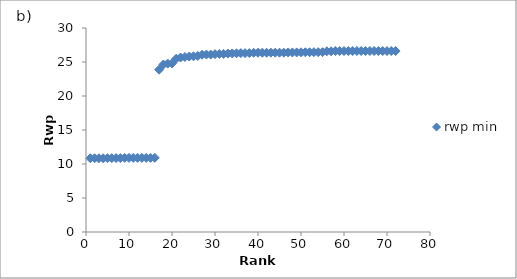
| Category | rwp min |
|---|---|
| 66.0 | 26.614 |
| 71.0 | 26.615 |
| 70.0 | 26.615 |
| 37.0 | 26.303 |
| 62.0 | 26.614 |
| 63.0 | 26.614 |
| 36.0 | 26.303 |
| 68.0 | 26.614 |
| 52.0 | 26.431 |
| 64.0 | 26.614 |
| 9.0 | 10.9 |
| 15.0 | 10.902 |
| 21.0 | 25.497 |
| 51.0 | 26.431 |
| 11.0 | 10.9 |
| 65.0 | 26.614 |
| 6.0 | 10.866 |
| 7.0 | 10.867 |
| 42.0 | 26.365 |
| 60.0 | 26.614 |
| 67.0 | 26.614 |
| 47.0 | 26.406 |
| 28.0 | 26.094 |
| 38.0 | 26.303 |
| 40.0 | 26.364 |
| 48.0 | 26.407 |
| 39.0 | 26.364 |
| 49.0 | 26.407 |
| 29.0 | 26.094 |
| 59.0 | 26.614 |
| 69.0 | 26.614 |
| 58.0 | 26.614 |
| 45.0 | 26.373 |
| 56.0 | 26.576 |
| 61.0 | 26.614 |
| 53.0 | 26.443 |
| 26.0 | 25.894 |
| 30.0 | 26.15 |
| 33.0 | 26.24 |
| 54.0 | 26.444 |
| 43.0 | 26.373 |
| 50.0 | 26.426 |
| 24.0 | 25.8 |
| 25.0 | 25.845 |
| 57.0 | 26.576 |
| 22.0 | 25.661 |
| 23.0 | 25.735 |
| 72.0 | 26.615 |
| 32.0 | 26.19 |
| 35.0 | 26.278 |
| 34.0 | 26.257 |
| 41.0 | 26.365 |
| 55.0 | 26.444 |
| 13.0 | 10.902 |
| 10.0 | 10.9 |
| 44.0 | 26.373 |
| 46.0 | 26.373 |
| 3.0 | 10.844 |
| 14.0 | 10.902 |
| 16.0 | 10.907 |
| 2.0 | 10.844 |
| 20.0 | 24.794 |
| 18.0 | 24.634 |
| 17.0 | 23.873 |
| 27.0 | 26.07 |
| 12.0 | 10.901 |
| 4.0 | 10.845 |
| 19.0 | 24.766 |
| 31.0 | 26.18 |
| 1.0 | 10.844 |
| 8.0 | 10.868 |
| 5.0 | 10.847 |